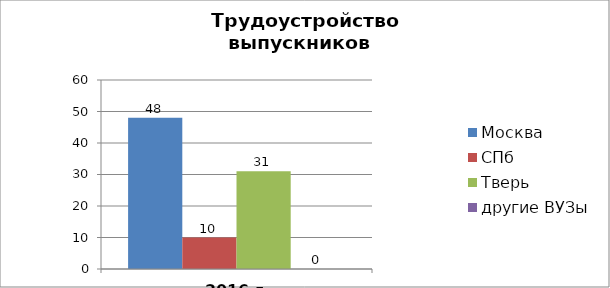
| Category | Москва | СПб | Тверь | другие ВУЗы |
|---|---|---|---|---|
| 2016 г. | 48 | 10 | 31 | 0 |